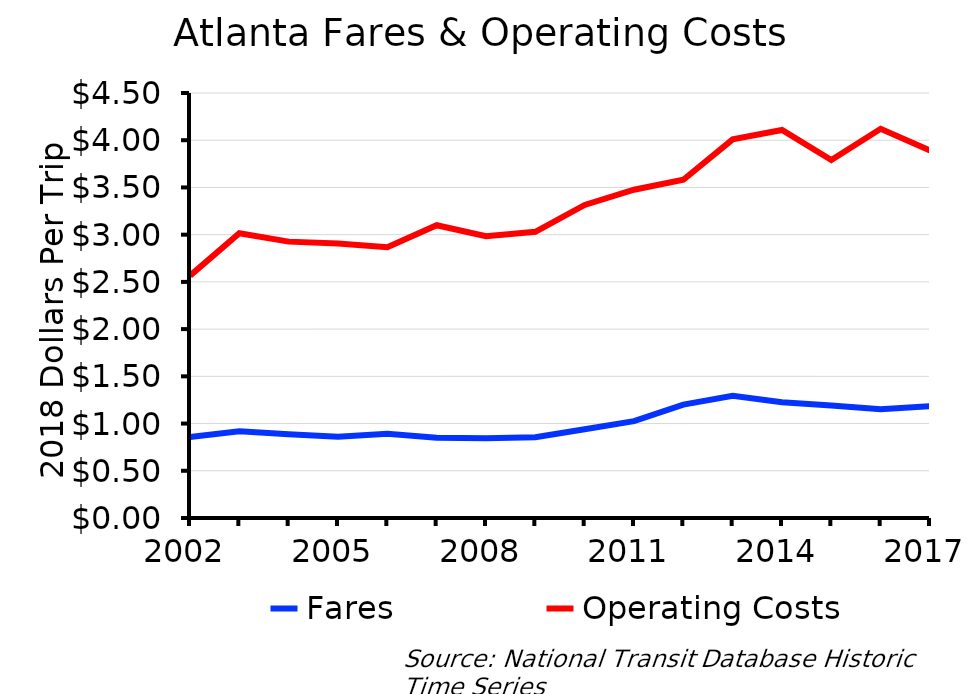
| Category | Fares | Operating Costs |
|---|---|---|
| 2002.0 | 0.859 | 2.565 |
| 2003.0 | 0.917 | 3.015 |
| 2004.0 | 0.887 | 2.926 |
| 2005.0 | 0.86 | 2.906 |
| 2006.0 | 0.891 | 2.868 |
| 2007.0 | 0.85 | 3.1 |
| 2008.0 | 0.845 | 2.983 |
| 2009.0 | 0.856 | 3.031 |
| 2010.0 | 0.94 | 3.315 |
| 2011.0 | 1.025 | 3.476 |
| 2012.0 | 1.201 | 3.582 |
| 2013.0 | 1.293 | 4.009 |
| 2014.0 | 1.227 | 4.109 |
| 2015.0 | 1.19 | 3.791 |
| 2016.0 | 1.152 | 4.121 |
| 2017.0 | 1.183 | 3.891 |